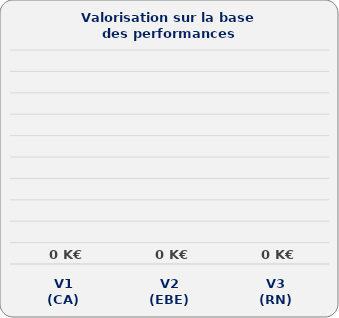
| Category | Series 0 |
|---|---|
| V1
(CA) | 0 |
| V2
(EBE) | 0 |
| V3
(RN) | 0 |